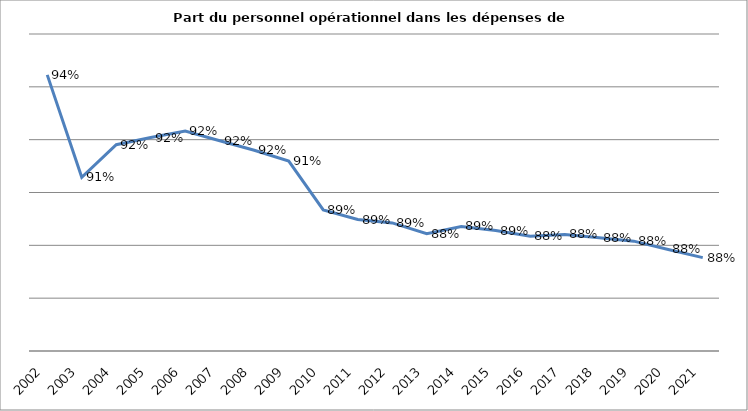
| Category | Series 0 |
|---|---|
| 2002.0 | 0.945 |
| 2003.0 | 0.906 |
| 2004.0 | 0.918 |
| 2005.0 | 0.921 |
| 2006.0 | 0.923 |
| 2007.0 | 0.92 |
| 2008.0 | 0.916 |
| 2009.0 | 0.912 |
| 2010.0 | 0.893 |
| 2011.0 | 0.89 |
| 2012.0 | 0.888 |
| 2013.0 | 0.884 |
| 2014.0 | 0.887 |
| 2015.0 | 0.886 |
| 2016.0 | 0.883 |
| 2017.0 | 0.884 |
| 2018.0 | 0.883 |
| 2019.0 | 0.882 |
| 2020.0 | 0.878 |
| 2021.0 | 0.875 |